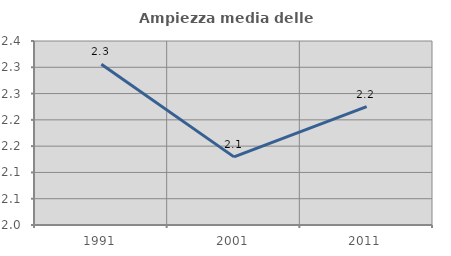
| Category | Ampiezza media delle famiglie |
|---|---|
| 1991.0 | 2.306 |
| 2001.0 | 2.13 |
| 2011.0 | 2.225 |